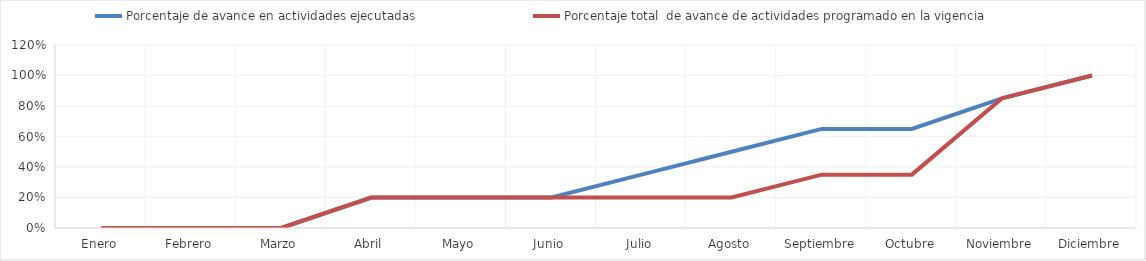
| Category | Porcentaje de avance en actividades ejecutadas | Porcentaje total  de avance de actividades programado en la vigencia |
|---|---|---|
| 0 | 0 | 0 |
| 1 | 0 | 0 |
| 2 | 0 | 0 |
| 3 | 0.2 | 0.2 |
| 4 | 0.2 | 0.2 |
| 5 | 0.2 | 0.2 |
| 6 | 0.35 | 0.2 |
| 7 | 0.5 | 0.2 |
| 8 | 0.65 | 0.35 |
| 9 | 0.65 | 0.35 |
| 10 | 0.85 | 0.85 |
| 11 | 1 | 1 |